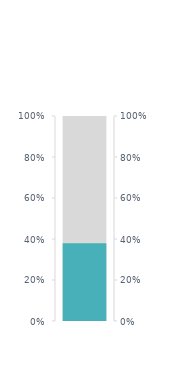
| Category | Wunschgewicht |
|---|---|
| 0 | 13.2 |